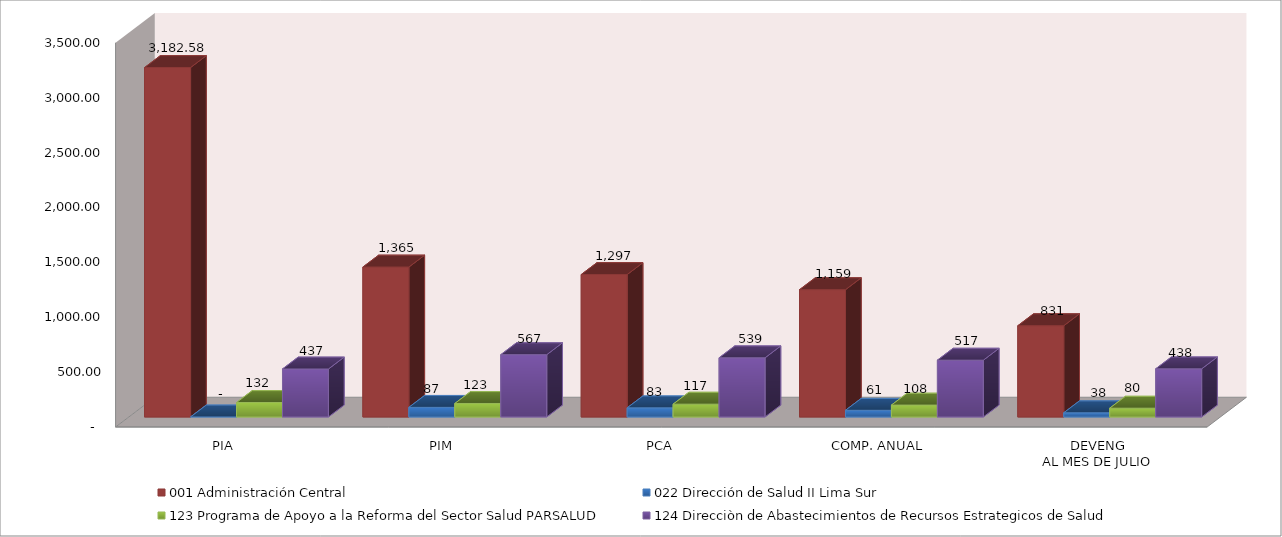
| Category | 001 Administración Central | 022 Dirección de Salud II Lima Sur | 123 Programa de Apoyo a la Reforma del Sector Salud PARSALUD | 124 Direcciòn de Abastecimientos de Recursos Estrategicos de Salud |
|---|---|---|---|---|
| PIA | 3182.583 | 0 | 131.558 | 436.9 |
| PIM | 1365.374 | 87.323 | 122.668 | 567.265 |
| PCA | 1297.106 | 82.956 | 116.535 | 538.902 |
| COMP. ANUAL | 1159.179 | 60.5 | 107.981 | 517.27 |
| DEVENG
AL MES DE JULIO | 830.953 | 38.154 | 79.897 | 438.344 |